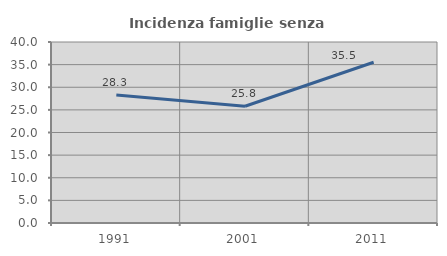
| Category | Incidenza famiglie senza nuclei |
|---|---|
| 1991.0 | 28.27 |
| 2001.0 | 25.81 |
| 2011.0 | 35.517 |